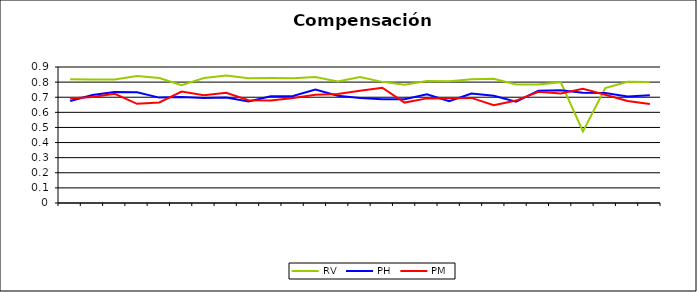
| Category | RV | PH | PM |
|---|---|---|---|
| 0 | 0.819 | 0.675 | 0.691 |
| 1 | 0.818 | 0.714 | 0.701 |
| 2 | 0.817 | 0.734 | 0.722 |
| 3 | 0.84 | 0.732 | 0.656 |
| 4 | 0.827 | 0.697 | 0.666 |
| 5 | 0.78 | 0.701 | 0.737 |
| 6 | 0.827 | 0.695 | 0.713 |
| 7 | 0.844 | 0.699 | 0.73 |
| 8 | 0.826 | 0.672 | 0.68 |
| 9 | 0.827 | 0.706 | 0.678 |
| 10 | 0.826 | 0.709 | 0.696 |
| 11 | 0.834 | 0.751 | 0.717 |
| 12 | 0.804 | 0.709 | 0.721 |
| 13 | 0.834 | 0.694 | 0.743 |
| 14 | 0.802 | 0.687 | 0.763 |
| 15 | 0.783 | 0.687 | 0.665 |
| 16 | 0.807 | 0.72 | 0.692 |
| 17 | 0.805 | 0.674 | 0.693 |
| 18 | 0.82 | 0.724 | 0.695 |
| 19 | 0.822 | 0.71 | 0.646 |
| 20 | 0.784 | 0.67 | 0.678 |
| 21 | 0.785 | 0.743 | 0.736 |
| 22 | 0.8 | 0.745 | 0.725 |
| 23 | 0.473 | 0.729 | 0.756 |
| 24 | 0.76 | 0.727 | 0.716 |
| 25 | 0.802 | 0.705 | 0.675 |
| 26 | 0.801 | 0.713 | 0.656 |